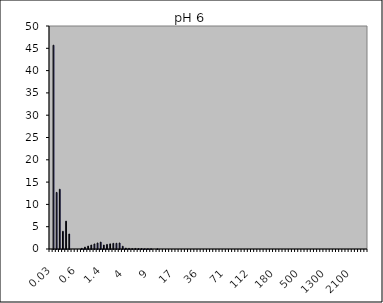
| Category | Magnetite pH 3 1 |
|---|---|
| 0.03 | 0 |
| 0.04 | 45.693 |
| 0.07 | 12.693 |
| 0.1 | 13.396 |
| 0.2 | 3.969 |
| 0.3 | 6.243 |
| 0.4 | 3.358 |
| 0.5 | 0 |
| 0.6 | 0 |
| 0.7 | 0 |
| 0.8 | 0.147 |
| 0.9 | 0.417 |
| 1.0 | 0.653 |
| 1.1 | 0.893 |
| 1.2 | 1.129 |
| 1.3 | 1.35 |
| 1.4 | 1.547 |
| 1.6 | 0.883 |
| 1.8 | 1.029 |
| 2.0 | 1.15 |
| 2.2 | 1.271 |
| 2.4 | 1.28 |
| 2.6 | 1.35 |
| 3.0 | 0.618 |
| 4.0 | 0.194 |
| 5.0 | 0.147 |
| 6.0 | 0.09 |
| 6.5 | 0.123 |
| 7.0 | 0.088 |
| 7.5 | 0.095 |
| 8.0 | 0.051 |
| 8.5 | 0.054 |
| 9.0 | 0.057 |
| 10.0 | 0 |
| 11.0 | 0.034 |
| 12.0 | 0 |
| 13.0 | 0 |
| 14.0 | 0 |
| 15.0 | 0 |
| 16.0 | 0 |
| 17.0 | 0 |
| 18.0 | 0 |
| 19.0 | 0 |
| 20.0 | 0 |
| 22.0 | 0 |
| 25.0 | 0 |
| 28.0 | 0 |
| 32.0 | 0 |
| 36.0 | 0 |
| 38.0 | 0 |
| 40.0 | 0 |
| 45.0 | 0 |
| 50.0 | 0 |
| 53.0 | 0 |
| 56.0 | 0 |
| 63.0 | 0 |
| 71.0 | 0 |
| 75.0 | 0 |
| 80.0 | 0 |
| 85.0 | 0 |
| 90.0 | 0 |
| 95.0 | 0 |
| 100.0 | 0 |
| 106.0 | 0 |
| 112.0 | 0 |
| 125.0 | 0 |
| 130.0 | 0 |
| 140.0 | 0 |
| 145.0 | 0 |
| 150.0 | 0 |
| 160.0 | 0 |
| 170.0 | 0 |
| 180.0 | 0 |
| 190.0 | 0 |
| 200.0 | 0 |
| 212.0 | 0 |
| 242.0 | 0 |
| 250.0 | 0 |
| 300.0 | 0 |
| 400.0 | 0 |
| 500.0 | 0 |
| 600.0 | 0 |
| 700.0 | 0 |
| 800.0 | 0 |
| 900.0 | 0 |
| 1000.0 | 0 |
| 1100.0 | 0 |
| 1200.0 | 0 |
| 1300.0 | 0 |
| 1400.0 | 0 |
| 1500.0 | 0 |
| 1600.0 | 0 |
| 1700.0 | 0 |
| 1800.0 | 0 |
| 1900.0 | 0 |
| 2000.0 | 0 |
| 2100.0 | 0 |
| 2200.0 | 0 |
| 2300.0 | 0 |
| 2400.0 | 0 |
| 2500.0 | 0 |